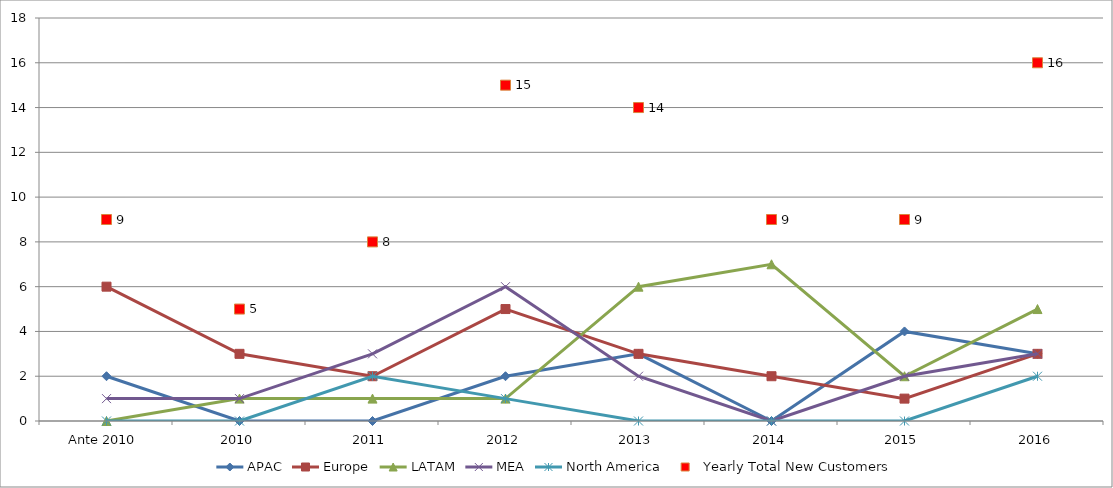
| Category | APAC | Europe | LATAM | MEA | North America | Yearly Total New Customers |
|---|---|---|---|---|---|---|
| Ante 2010 | 2 | 6 | 0 | 1 | 0 | 9 |
| 2010 | 0 | 3 | 1 | 1 | 0 | 5 |
| 2011 | 0 | 2 | 1 | 3 | 2 | 8 |
| 2012 | 2 | 5 | 1 | 6 | 1 | 15 |
| 2013 | 3 | 3 | 6 | 2 | 0 | 14 |
| 2014 | 0 | 2 | 7 | 0 | 0 | 9 |
| 2015 | 4 | 1 | 2 | 2 | 0 | 9 |
| 2016 | 3 | 3 | 5 | 3 | 2 | 16 |